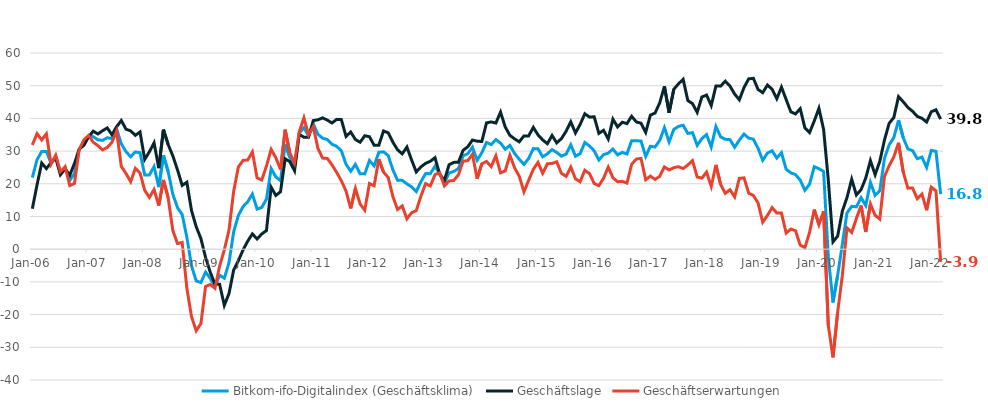
| Category | Bitkom-ifo-Digitalindex (Geschäftsklima) | Geschäftslage | Geschäftserwartungen |
|---|---|---|---|
| 2006-01-01 | 21.909 | 12.368 | 31.878 |
| 2006-02-01 | 27.361 | 19.656 | 35.337 |
| 2006-03-01 | 29.862 | 26.353 | 33.426 |
| 2006-04-01 | 29.91 | 24.647 | 35.295 |
| 2006-05-01 | 26.263 | 26.494 | 26.031 |
| 2006-06-01 | 28.304 | 27.854 | 28.754 |
| 2006-07-01 | 23.241 | 22.748 | 23.735 |
| 2006-08-01 | 24.882 | 24.551 | 25.214 |
| 2006-09-01 | 21.041 | 22.635 | 19.458 |
| 2006-10-01 | 23.161 | 26.26 | 20.105 |
| 2006-11-01 | 30.513 | 30.568 | 30.459 |
| 2006-12-01 | 32.585 | 31.759 | 33.413 |
| 2007-01-01 | 34.556 | 34.318 | 34.794 |
| 2007-02-01 | 34.402 | 36.095 | 32.721 |
| 2007-03-01 | 33.445 | 35.244 | 31.658 |
| 2007-04-01 | 33.283 | 36.232 | 30.371 |
| 2007-05-01 | 34.084 | 37.088 | 31.118 |
| 2007-06-01 | 33.842 | 34.996 | 32.693 |
| 2007-07-01 | 36.779 | 37.455 | 36.106 |
| 2007-08-01 | 32.226 | 39.352 | 25.311 |
| 2007-09-01 | 29.829 | 36.709 | 23.15 |
| 2007-10-01 | 28.277 | 36.181 | 20.637 |
| 2007-11-01 | 29.724 | 34.821 | 24.737 |
| 2007-12-01 | 29.497 | 35.851 | 23.314 |
| 2008-01-01 | 22.684 | 27.459 | 18.009 |
| 2008-02-01 | 22.708 | 29.791 | 15.843 |
| 2008-03-01 | 25.281 | 32.525 | 18.263 |
| 2008-04-01 | 18.982 | 24.781 | 13.332 |
| 2008-05-01 | 28.741 | 36.56 | 21.181 |
| 2008-06-01 | 23.761 | 32.034 | 15.784 |
| 2008-07-01 | 16.846 | 28.546 | 5.744 |
| 2008-08-01 | 12.716 | 24.31 | 1.722 |
| 2008-09-01 | 10.616 | 19.501 | 2.092 |
| 2008-10-01 | 3.657 | 20.482 | -11.885 |
| 2008-11-01 | -5.115 | 11.781 | -20.662 |
| 2008-12-01 | -9.694 | 6.874 | -24.935 |
| 2009-01-01 | -10.192 | 3.258 | -22.752 |
| 2009-02-01 | -7.014 | -2.528 | -11.397 |
| 2009-03-01 | -8.919 | -7.027 | -10.793 |
| 2009-04-01 | -11.331 | -10.706 | -11.954 |
| 2009-05-01 | -7.947 | -10.721 | -5.132 |
| 2009-06-01 | -8.888 | -17.177 | -0.224 |
| 2009-07-01 | -4.118 | -13.58 | 5.825 |
| 2009-08-01 | 5.342 | -6.349 | 17.739 |
| 2009-09-01 | 10.321 | -3.513 | 25.13 |
| 2009-10-01 | 13.013 | -0.242 | 27.149 |
| 2009-11-01 | 14.515 | 2.467 | 27.279 |
| 2009-12-01 | 16.857 | 4.686 | 29.753 |
| 2010-01-01 | 12.269 | 3.137 | 21.812 |
| 2010-02-01 | 12.756 | 4.654 | 21.179 |
| 2010-03-01 | 15.328 | 5.709 | 25.396 |
| 2010-04-01 | 24.668 | 18.961 | 30.523 |
| 2010-05-01 | 22.133 | 16.432 | 27.984 |
| 2010-06-01 | 20.947 | 17.575 | 24.371 |
| 2010-07-01 | 32.04 | 27.622 | 36.544 |
| 2010-08-01 | 28.09 | 26.773 | 29.415 |
| 2010-09-01 | 25.162 | 23.985 | 26.346 |
| 2010-10-01 | 35.465 | 35.121 | 35.81 |
| 2010-11-01 | 37.185 | 34.245 | 40.162 |
| 2010-12-01 | 34.594 | 34.269 | 34.919 |
| 2011-01-01 | 38.395 | 39.33 | 37.463 |
| 2011-02-01 | 35.149 | 39.575 | 30.804 |
| 2011-03-01 | 33.93 | 40.165 | 27.857 |
| 2011-04-01 | 33.54 | 39.474 | 27.754 |
| 2011-05-01 | 32.112 | 38.603 | 25.797 |
| 2011-06-01 | 31.448 | 39.7 | 23.481 |
| 2011-07-01 | 30.086 | 39.626 | 20.925 |
| 2011-08-01 | 25.974 | 34.494 | 17.764 |
| 2011-09-01 | 23.845 | 35.839 | 12.461 |
| 2011-10-01 | 25.933 | 33.548 | 18.567 |
| 2011-11-01 | 23.077 | 32.71 | 13.842 |
| 2011-12-01 | 23.035 | 34.696 | 11.953 |
| 2012-01-01 | 27.134 | 34.399 | 20.094 |
| 2012-02-01 | 25.501 | 31.785 | 19.387 |
| 2012-03-01 | 29.655 | 31.759 | 27.57 |
| 2012-04-01 | 29.775 | 36.144 | 23.578 |
| 2012-05-01 | 28.668 | 35.606 | 21.934 |
| 2012-06-01 | 24.269 | 32.731 | 16.115 |
| 2012-07-01 | 21.092 | 30.417 | 12.145 |
| 2012-08-01 | 21.052 | 29.149 | 13.241 |
| 2012-09-01 | 19.978 | 31.228 | 9.276 |
| 2012-10-01 | 19.07 | 27.288 | 11.148 |
| 2012-11-01 | 17.642 | 23.628 | 11.816 |
| 2012-12-01 | 20.656 | 25.175 | 16.229 |
| 2013-01-01 | 23.145 | 26.26 | 20.072 |
| 2013-02-01 | 23.088 | 26.893 | 19.347 |
| 2013-03-01 | 25.376 | 27.977 | 22.804 |
| 2013-04-01 | 23.139 | 22.91 | 23.368 |
| 2013-05-01 | 20.188 | 21.013 | 19.366 |
| 2013-06-01 | 23.316 | 25.803 | 20.856 |
| 2013-07-01 | 23.767 | 26.546 | 21.022 |
| 2013-08-01 | 24.663 | 26.593 | 22.748 |
| 2013-09-01 | 28.575 | 30.226 | 26.937 |
| 2013-10-01 | 29.191 | 31.33 | 27.071 |
| 2013-11-01 | 31.19 | 33.385 | 29.016 |
| 2013-12-01 | 27.213 | 33.037 | 21.535 |
| 2014-01-01 | 29.5 | 32.925 | 26.126 |
| 2014-02-01 | 32.665 | 38.629 | 26.85 |
| 2014-03-01 | 31.986 | 38.928 | 25.246 |
| 2014-04-01 | 33.515 | 38.586 | 28.552 |
| 2014-05-01 | 32.451 | 41.927 | 23.346 |
| 2014-06-01 | 30.569 | 37.374 | 23.96 |
| 2014-07-01 | 31.752 | 34.805 | 28.74 |
| 2014-08-01 | 29.268 | 33.736 | 24.884 |
| 2014-09-01 | 27.504 | 32.844 | 22.287 |
| 2014-10-01 | 25.93 | 34.652 | 17.532 |
| 2014-11-01 | 27.759 | 34.65 | 21.071 |
| 2014-12-01 | 30.762 | 37.257 | 24.444 |
| 2015-01-01 | 30.708 | 34.959 | 26.534 |
| 2015-02-01 | 28.262 | 33.426 | 23.213 |
| 2015-03-01 | 29.169 | 32.263 | 26.116 |
| 2015-04-01 | 30.464 | 34.775 | 26.233 |
| 2015-05-01 | 29.599 | 32.51 | 26.723 |
| 2015-06-01 | 28.456 | 33.829 | 23.207 |
| 2015-07-01 | 29.066 | 36.058 | 22.281 |
| 2015-08-01 | 31.94 | 38.939 | 25.146 |
| 2015-09-01 | 28.429 | 35.553 | 21.52 |
| 2015-10-01 | 29.227 | 38.158 | 20.63 |
| 2015-11-01 | 32.617 | 41.416 | 24.139 |
| 2015-12-01 | 31.592 | 40.39 | 23.117 |
| 2016-01-01 | 30.074 | 40.503 | 20.097 |
| 2016-02-01 | 27.284 | 35.421 | 19.428 |
| 2016-03-01 | 28.918 | 36.372 | 21.699 |
| 2016-04-01 | 29.379 | 33.725 | 25.114 |
| 2016-05-01 | 30.633 | 39.768 | 21.847 |
| 2016-06-01 | 28.854 | 37.377 | 20.638 |
| 2016-07-01 | 29.615 | 38.836 | 20.75 |
| 2016-08-01 | 29.129 | 38.407 | 20.213 |
| 2016-09-01 | 33.195 | 40.643 | 25.977 |
| 2016-10-01 | 33.177 | 38.926 | 27.566 |
| 2016-11-01 | 33.072 | 38.519 | 27.749 |
| 2016-12-01 | 28.371 | 35.719 | 21.252 |
| 2017-01-01 | 31.489 | 40.989 | 22.364 |
| 2017-02-01 | 31.262 | 41.643 | 21.327 |
| 2017-03-01 | 33.268 | 44.775 | 22.302 |
| 2017-04-01 | 37.173 | 49.813 | 25.173 |
| 2017-05-01 | 32.821 | 41.744 | 24.227 |
| 2017-06-01 | 36.623 | 48.908 | 24.945 |
| 2017-07-01 | 37.553 | 50.568 | 25.214 |
| 2017-08-01 | 37.91 | 51.941 | 24.661 |
| 2017-09-01 | 35.399 | 45.453 | 25.757 |
| 2017-10-01 | 35.648 | 44.515 | 27.103 |
| 2017-11-01 | 31.762 | 41.858 | 22.087 |
| 2017-12-01 | 33.811 | 46.549 | 21.731 |
| 2018-01-01 | 35.058 | 47.136 | 23.569 |
| 2018-02-01 | 31.254 | 43.929 | 19.237 |
| 2018-03-01 | 37.531 | 49.898 | 25.776 |
| 2018-04-01 | 34.359 | 49.87 | 19.812 |
| 2018-05-01 | 33.606 | 51.387 | 17.082 |
| 2018-06-01 | 33.503 | 49.88 | 18.2 |
| 2018-07-01 | 31.178 | 47.451 | 15.974 |
| 2018-08-01 | 33.367 | 45.687 | 21.666 |
| 2018-09-01 | 35.22 | 49.439 | 21.811 |
| 2018-10-01 | 33.97 | 52.089 | 17.153 |
| 2018-11-01 | 33.65 | 52.259 | 16.414 |
| 2018-12-01 | 30.85 | 48.846 | 14.156 |
| 2019-01-01 | 27.188 | 47.866 | 8.236 |
| 2019-02-01 | 29.399 | 50.209 | 10.319 |
| 2019-03-01 | 30.117 | 48.927 | 12.728 |
| 2019-04-01 | 27.864 | 46.012 | 11.055 |
| 2019-05-01 | 29.52 | 49.563 | 11.086 |
| 2019-06-01 | 24.437 | 45.778 | 4.949 |
| 2019-07-01 | 23.363 | 42.002 | 6.159 |
| 2019-08-01 | 22.799 | 41.372 | 5.654 |
| 2019-09-01 | 21.155 | 42.982 | 1.289 |
| 2019-10-01 | 18.018 | 37.106 | 0.467 |
| 2019-11-01 | 19.874 | 35.677 | 5.131 |
| 2019-12-01 | 25.245 | 39.193 | 12.111 |
| 2020-01-01 | 24.596 | 43.094 | 7.507 |
| 2020-02-01 | 23.779 | 36.614 | 11.641 |
| 2020-03-01 | -2.286 | 21.215 | -23.29 |
| 2020-04-01 | -16.268 | 2.217 | -33.063 |
| 2020-05-01 | -7.988 | 4.003 | -19.275 |
| 2020-06-01 | 1.548 | 11.621 | -8.046 |
| 2020-07-01 | 11.111 | 15.805 | 6.52 |
| 2020-08-01 | 13.102 | 21.38 | 5.134 |
| 2020-09-01 | 12.959 | 16.589 | 9.39 |
| 2020-10-01 | 15.767 | 18.187 | 13.374 |
| 2020-11-01 | 13.356 | 21.757 | 5.273 |
| 2020-12-01 | 20.376 | 27.097 | 13.853 |
| 2021-01-01 | 16.489 | 22.764 | 10.39 |
| 2021-02-01 | 17.875 | 26.889 | 9.22 |
| 2021-03-01 | 27.773 | 33.41 | 22.272 |
| 2021-04-01 | 31.917 | 38.501 | 25.516 |
| 2021-05-01 | 34.152 | 40.263 | 28.196 |
| 2021-06-01 | 39.495 | 46.648 | 32.549 |
| 2021-07-01 | 34.113 | 45.093 | 23.625 |
| 2021-08-01 | 30.68 | 43.345 | 18.673 |
| 2021-09-01 | 30.138 | 42.165 | 18.708 |
| 2021-10-01 | 27.678 | 40.611 | 15.44 |
| 2021-11-01 | 28.165 | 40.033 | 16.884 |
| 2021-12-01 | 25.013 | 38.901 | 11.933 |
| 2022-01-01 | 30.208 | 42.052 | 18.943 |
| 2022-02-01 | 29.9 | 42.615 | 17.851 |
| 2022-03-01 | 16.846 | 39.787 | -3.9 |